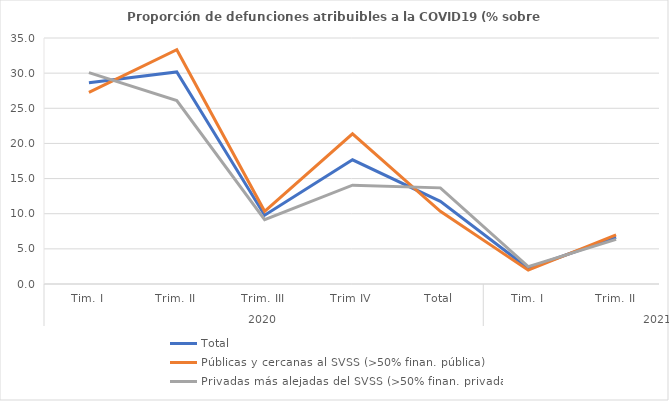
| Category | Total | Públicas y cercanas al SVSS (>50% finan. pública) | Privadas más alejadas del SVSS (>50% finan. privada) |
|---|---|---|---|
| 0 | 28.62 | 27.273 | 30.07 |
| 1 | 30.168 | 33.333 | 26.093 |
| 2 | 9.789 | 10.345 | 9.165 |
| 3 | 17.673 | 21.364 | 14.06 |
| 4 | 11.769 | 10.345 | 13.678 |
| 5 | 2.239 | 1.967 | 2.466 |
| 6 | 6.65 | 6.977 | 6.353 |